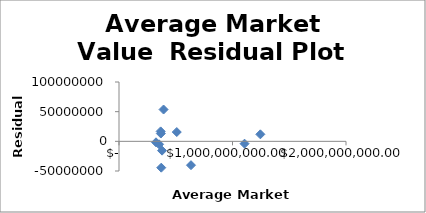
| Category | Series 0 |
|---|---|
| 1245333333.3333333 | 11793797.09 |
| 1106166666.6666667 | -3963431.059 |
| 634300000.0 | -40193208.705 |
| 509033333.3333333 | 15659327.011 |
| 392533333.3333333 | 53606270.154 |
| 368766666.6666667 | 13148808.197 |
| 367000000.0 | 16757159.552 |
| 379466666.6666667 | -15705546.238 |
| 372466666.6666667 | -44408305.019 |
| 353200000.0 | -5056850.616 |
| 326066666.6666667 | -1638020.368 |